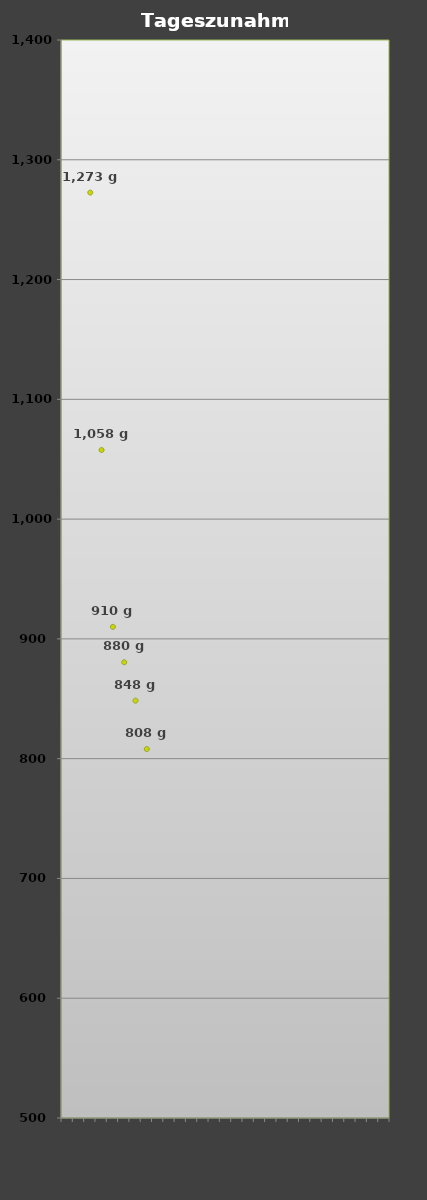
| Category | TGZ Verkauf |
|---|---|
|  | 0 |
|  | 0 |
|  | 1272.618 |
| 15.09.2016 | 1057.683 |
| 02.10.2016 | 910.055 |
| 15.10.2016 | 880.465 |
| 20.10.2016 | 848.412 |
| 23.10.2016 | 808.013 |
| 24.10.2016 | 0 |